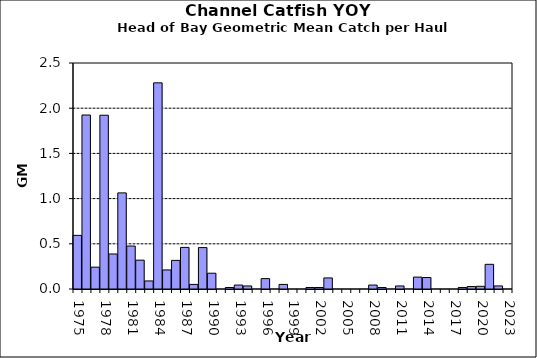
| Category | Series 0 |
|---|---|
| 1975.0 | 0.593 |
| 1976.0 | 1.925 |
| 1977.0 | 0.241 |
| 1978.0 | 1.922 |
| 1979.0 | 0.387 |
| 1980.0 | 1.063 |
| 1981.0 | 0.475 |
| 1982.0 | 0.319 |
| 1983.0 | 0.089 |
| 1984.0 | 2.28 |
| 1985.0 | 0.211 |
| 1986.0 | 0.317 |
| 1987.0 | 0.46 |
| 1988.0 | 0.051 |
| 1989.0 | 0.458 |
| 1990.0 | 0.175 |
| 1991.0 | 0 |
| 1992.0 | 0.017 |
| 1993.0 | 0.044 |
| 1994.0 | 0.034 |
| 1995.0 | 0 |
| 1996.0 | 0.115 |
| 1997.0 | 0 |
| 1998.0 | 0.051 |
| 1999.0 | 0 |
| 2000.0 | 0 |
| 2001.0 | 0.017 |
| 2002.0 | 0.017 |
| 2003.0 | 0.122 |
| 2004.0 | 0 |
| 2005.0 | 0 |
| 2006.0 | 0 |
| 2007.0 | 0 |
| 2008.0 | 0.044 |
| 2009.0 | 0.017 |
| 2010.0 | 0 |
| 2011.0 | 0.034 |
| 2012.0 | 0 |
| 2013.0 | 0.132 |
| 2014.0 | 0.127 |
| 2015.0 | 0 |
| 2016.0 | 0 |
| 2017.0 | 0 |
| 2018.0 | 0.017 |
| 2019.0 | 0.027 |
| 2020.0 | 0.03 |
| 2021.0 | 0.273 |
| 2022.0 | 0.034 |
| 2023.0 | 0 |